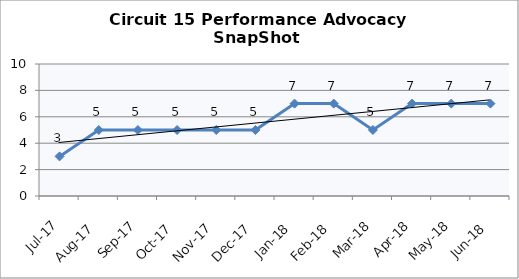
| Category | Circuit 15 |
|---|---|
| Jul-17 | 3 |
| Aug-17 | 5 |
| Sep-17 | 5 |
| Oct-17 | 5 |
| Nov-17 | 5 |
| Dec-17 | 5 |
| Jan-18 | 7 |
| Feb-18 | 7 |
| Mar-18 | 5 |
| Apr-18 | 7 |
| May-18 | 7 |
| Jun-18 | 7 |